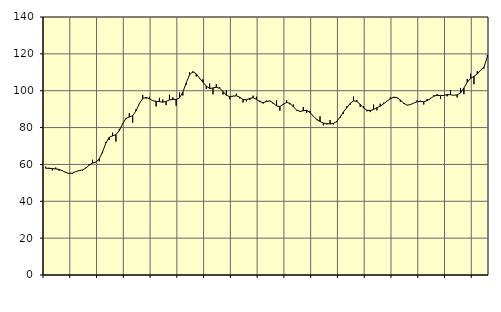
| Category | Piggar | Series 1 |
|---|---|---|
| nan | 58.8 | 57.93 |
| 87.0 | 58.2 | 57.89 |
| 87.0 | 56.8 | 57.73 |
| 87.0 | 58.3 | 57.58 |
| nan | 56.6 | 57.33 |
| 88.0 | 56.9 | 56.59 |
| 88.0 | 55.9 | 55.66 |
| 88.0 | 54.9 | 55.1 |
| nan | 54.8 | 55.29 |
| 89.0 | 56.1 | 56.08 |
| 89.0 | 56.8 | 56.66 |
| 89.0 | 56.4 | 57.04 |
| nan | 58.3 | 57.99 |
| 90.0 | 60.1 | 59.6 |
| 90.0 | 62.5 | 60.78 |
| 90.0 | 61.4 | 61.25 |
| nan | 61.7 | 62.96 |
| 91.0 | 66.1 | 66.83 |
| 91.0 | 72 | 71.6 |
| 91.0 | 73.3 | 74.73 |
| nan | 77.2 | 75.5 |
| 92.0 | 72.4 | 76.16 |
| 92.0 | 79.3 | 78.32 |
| 92.0 | 81.9 | 82.06 |
| nan | 85.1 | 84.96 |
| 93.0 | 87.8 | 85.74 |
| 93.0 | 82.7 | 86.49 |
| 93.0 | 89.9 | 89.05 |
| nan | 92.7 | 92.99 |
| 94.0 | 97.7 | 95.79 |
| 94.0 | 95.7 | 96.39 |
| 94.0 | 96.7 | 95.63 |
| nan | 94.5 | 94.61 |
| 95.0 | 91.5 | 94.24 |
| 95.0 | 96.1 | 94.09 |
| 95.0 | 95.2 | 93.77 |
| nan | 92.2 | 94.2 |
| 96.0 | 97.8 | 94.99 |
| 96.0 | 96.4 | 95.29 |
| 96.0 | 91.9 | 95.28 |
| nan | 99 | 96.09 |
| 97.0 | 97.4 | 99.31 |
| 97.0 | 103.3 | 104.17 |
| 97.0 | 110 | 108.63 |
| nan | 109.7 | 110.35 |
| 98.0 | 107.7 | 109.13 |
| 98.0 | 106.4 | 106.79 |
| 98.0 | 106.2 | 104.64 |
| nan | 101 | 102.52 |
| 99.0 | 103.9 | 101.23 |
| 99.0 | 98 | 101.5 |
| 99.0 | 103.6 | 101.84 |
| nan | 101.9 | 101.31 |
| 0.0 | 97.9 | 99.6 |
| 0.0 | 100.2 | 97.54 |
| 0.0 | 95.4 | 96.78 |
| nan | 97 | 97.06 |
| 1.0 | 98.4 | 97.23 |
| 1.0 | 95.8 | 96.47 |
| 1.0 | 93.6 | 95.25 |
| nan | 94.2 | 95.08 |
| 2.0 | 94.9 | 95.82 |
| 2.0 | 97.3 | 96.18 |
| 2.0 | 96.7 | 95.35 |
| nan | 94.6 | 94.05 |
| 3.0 | 93 | 93.55 |
| 3.0 | 94.7 | 94.12 |
| 3.0 | 94.6 | 94.42 |
| nan | 92.9 | 93.32 |
| 4.0 | 94.7 | 91.77 |
| 4.0 | 89.2 | 91.4 |
| 4.0 | 92.9 | 92.51 |
| nan | 94.9 | 93.64 |
| 5.0 | 92.6 | 93.18 |
| 5.0 | 92.5 | 91.31 |
| 5.0 | 89.3 | 89.53 |
| nan | 88.5 | 88.79 |
| 6.0 | 91.1 | 89.14 |
| 6.0 | 88.1 | 89.38 |
| 6.0 | 89 | 88.2 |
| nan | 86.1 | 86.19 |
| 7.0 | 84 | 84.46 |
| 7.0 | 86.1 | 83.27 |
| 7.0 | 81.2 | 82.46 |
| nan | 81.7 | 82.11 |
| 8.0 | 84.1 | 82 |
| 8.0 | 81.7 | 82.21 |
| 8.0 | 82.9 | 83.34 |
| nan | 85.3 | 85.69 |
| 9.0 | 87.5 | 88.5 |
| 9.0 | 91.6 | 90.8 |
| 9.0 | 92.4 | 93.07 |
| nan | 96.8 | 94.49 |
| 10.0 | 94.9 | 94.14 |
| 10.0 | 91.3 | 92.6 |
| 10.0 | 91.6 | 90.67 |
| nan | 88.8 | 89.42 |
| 11.0 | 88.4 | 89.24 |
| 11.0 | 92.5 | 89.82 |
| 11.0 | 89.3 | 90.81 |
| nan | 93 | 91.62 |
| 12.0 | 93.5 | 92.88 |
| 12.0 | 94.5 | 94.38 |
| 12.0 | 96.4 | 95.6 |
| nan | 96.1 | 96.51 |
| 13.0 | 96.5 | 96.23 |
| 13.0 | 94 | 95 |
| 13.0 | 92.8 | 93.24 |
| nan | 92.2 | 92.13 |
| 14.0 | 92.4 | 92.45 |
| 14.0 | 93.3 | 93.3 |
| 14.0 | 94.7 | 94.04 |
| nan | 94.6 | 94.14 |
| 15.0 | 92.5 | 94.09 |
| 15.0 | 95.5 | 94.6 |
| 15.0 | 96.1 | 95.71 |
| nan | 97.5 | 97.04 |
| 16.0 | 98.2 | 97.51 |
| 16.0 | 95.6 | 97.32 |
| 16.0 | 97.6 | 97.48 |
| nan | 97 | 97.92 |
| 17.0 | 100.3 | 97.81 |
| 17.0 | 97.5 | 97.54 |
| 17.0 | 96.3 | 97.75 |
| nan | 101.5 | 98.79 |
| 18.0 | 98.1 | 101.45 |
| 18.0 | 106.4 | 104.63 |
| 18.0 | 109.2 | 106.71 |
| nan | 103.5 | 107.81 |
| 19.0 | 110.7 | 109.06 |
| 19.0 | 111 | 111.17 |
| 19.0 | 112 | 112.75 |
| nan | 119.4 | 118.45 |